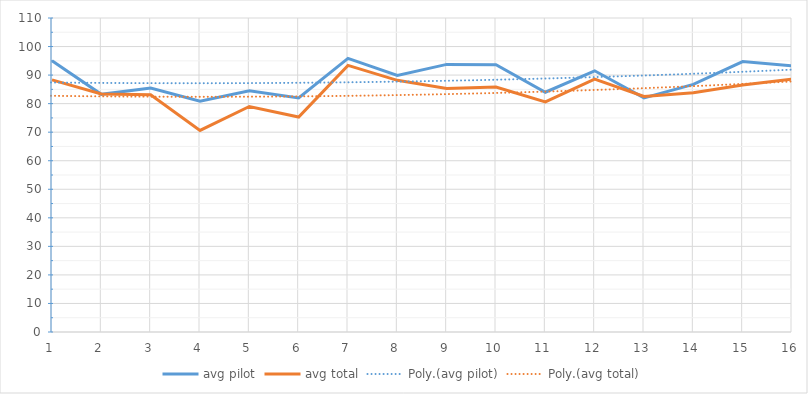
| Category | avg pilot | avg total |
|---|---|---|
| 0 | 95 | 88.333 |
| 1 | 83.25 | 83.4 |
| 2 | 85.5 | 83.111 |
| 3 | 80.875 | 70.611 |
| 4 | 84.5 | 79 |
| 5 | 82 | 75.296 |
| 6 | 95.875 | 93.389 |
| 7 | 89.875 | 88.167 |
| 8 | 93.75 | 85.296 |
| 9 | 93.625 | 85.833 |
| 10 | 84 | 80.63 |
| 11 | 91.5 | 88.593 |
| 12 | 82 | 82.519 |
| 13 | 86.75 | 83.778 |
| 14 | 94.75 | 86.556 |
| 15 | 93.25 | 88.556 |